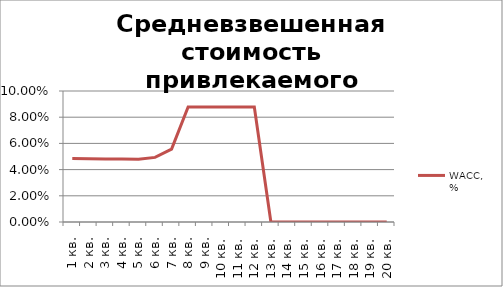
| Category | WACC, % |
|---|---|
| 1 кв. | 0.048 |
| 2 кв. | 0.048 |
| 3 кв. | 0.048 |
| 4 кв. | 0.048 |
| 5 кв. | 0.048 |
| 6 кв. | 0.049 |
| 7 кв. | 0.056 |
| 8 кв. | 0.088 |
| 9 кв. | 0.088 |
| 10 кв. | 0.088 |
| 11 кв. | 0.088 |
| 12 кв. | 0.088 |
| 13 кв. | 0 |
| 14 кв. | 0 |
| 15 кв. | 0 |
| 16 кв. | 0 |
| 17 кв. | 0 |
| 18 кв. | 0 |
| 19 кв. | 0 |
| 20 кв. | 0 |